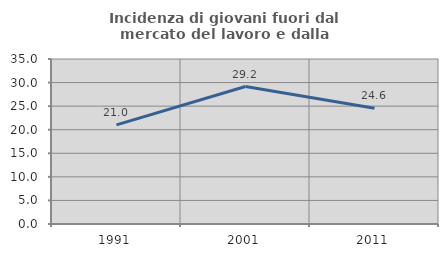
| Category | Incidenza di giovani fuori dal mercato del lavoro e dalla formazione  |
|---|---|
| 1991.0 | 21.033 |
| 2001.0 | 29.167 |
| 2011.0 | 24.572 |